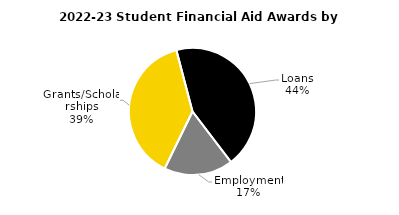
| Category | Series 0 |
|---|---|
| Grants/Scholarships | 205207694 |
| Loans | 232002209 |
| Employment | 93339952 |